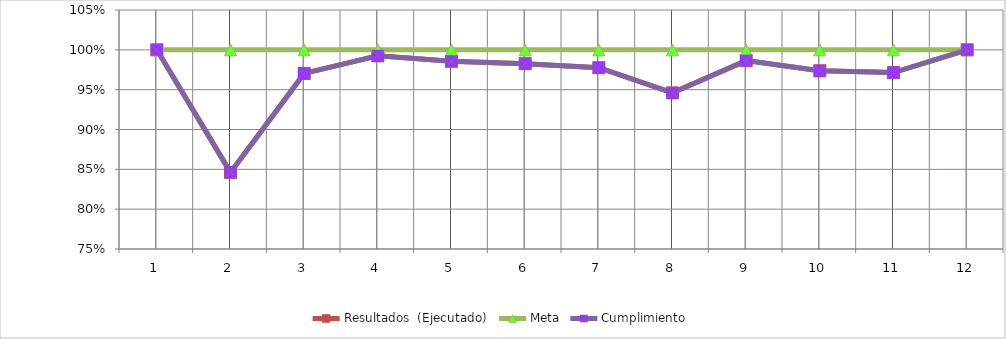
| Category | Resultados  (Ejecutado) | Meta | Cumplimiento |
|---|---|---|---|
| 0 | 1 | 1 | 1 |
| 1 | 0.846 | 1 | 0.846 |
| 2 | 0.97 | 1 | 0.97 |
| 3 | 0.992 | 1 | 0.992 |
| 4 | 0.986 | 1 | 0.986 |
| 5 | 0.983 | 1 | 0.983 |
| 6 | 0.978 | 1 | 0.978 |
| 7 | 0.946 | 1 | 0.946 |
| 8 | 0.986 | 1 | 0.986 |
| 9 | 0.974 | 1 | 0.974 |
| 10 | 0.971 | 1 | 0.971 |
| 11 | 1 | 1 | 1 |